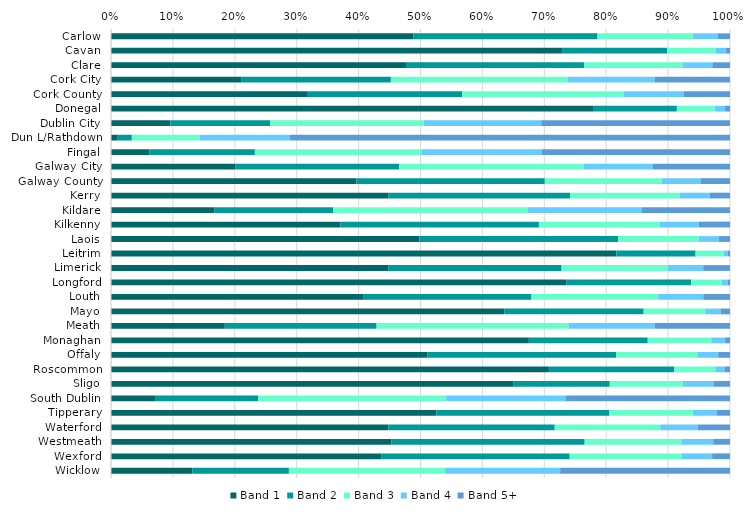
| Category | Band 1 | Band 2 | Band 3 | Band 4 | Band 5+ |
|---|---|---|---|---|---|
| Carlow | 0.488 | 0.298 | 0.154 | 0.04 | 0.02 |
| Cavan | 0.729 | 0.17 | 0.078 | 0.017 | 0.006 |
| Clare | 0.477 | 0.288 | 0.159 | 0.048 | 0.028 |
| Cork City | 0.211 | 0.241 | 0.285 | 0.141 | 0.122 |
| Cork County | 0.318 | 0.249 | 0.261 | 0.097 | 0.075 |
| Donegal | 0.779 | 0.136 | 0.061 | 0.017 | 0.008 |
| Dublin City | 0.096 | 0.161 | 0.248 | 0.19 | 0.305 |
| Dun L/Rathdown | 0.01 | 0.024 | 0.11 | 0.145 | 0.711 |
| Fingal | 0.062 | 0.171 | 0.27 | 0.193 | 0.304 |
| Galway City | 0.201 | 0.264 | 0.297 | 0.113 | 0.124 |
| Galway County | 0.396 | 0.304 | 0.189 | 0.063 | 0.047 |
| Kerry | 0.449 | 0.293 | 0.177 | 0.049 | 0.032 |
| Kildare | 0.167 | 0.192 | 0.314 | 0.184 | 0.143 |
| Kilkenny | 0.371 | 0.321 | 0.195 | 0.063 | 0.051 |
| Laois | 0.498 | 0.321 | 0.13 | 0.032 | 0.018 |
| Leitrim | 0.816 | 0.128 | 0.046 | 0.007 | 0.003 |
| Limerick | 0.448 | 0.28 | 0.171 | 0.058 | 0.043 |
| Longford | 0.735 | 0.202 | 0.049 | 0.01 | 0.004 |
| Louth | 0.407 | 0.272 | 0.205 | 0.073 | 0.043 |
| Mayo | 0.635 | 0.225 | 0.1 | 0.025 | 0.015 |
| Meath | 0.184 | 0.245 | 0.31 | 0.139 | 0.122 |
| Monaghan | 0.675 | 0.192 | 0.103 | 0.023 | 0.008 |
| Offaly | 0.512 | 0.305 | 0.131 | 0.034 | 0.019 |
| Roscommon | 0.707 | 0.203 | 0.066 | 0.015 | 0.009 |
| Sligo | 0.65 | 0.155 | 0.118 | 0.049 | 0.027 |
| South Dublin | 0.071 | 0.166 | 0.304 | 0.193 | 0.266 |
| Tipperary | 0.526 | 0.279 | 0.135 | 0.039 | 0.021 |
| Waterford | 0.448 | 0.269 | 0.171 | 0.06 | 0.052 |
| Westmeath | 0.453 | 0.312 | 0.156 | 0.052 | 0.027 |
| Wexford | 0.437 | 0.304 | 0.18 | 0.05 | 0.029 |
| Wicklow | 0.131 | 0.156 | 0.252 | 0.186 | 0.274 |